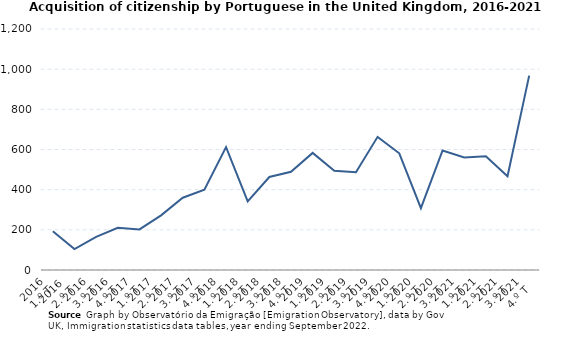
| Category | Series 0 |
|---|---|
| 2016
1.º T | 193 |
| 2016 
2.º T | 104 |
| 2016
3.º T | 165 |
| 2016
4.º T | 210 |
| 2017
1.º T | 202 |
| 2017
2.º T | 272 |
| 2017
3.º T | 360 |
| 2017
4.º T | 400 |
| 2018
1.º T | 612 |
| 2018
2.º T | 342 |
| 2018
3.º T | 463 |
| 2018
4.º T | 489 |
| 2019
1.º T | 583 |
| 2019
2.º T | 494 |
| 2019
3.º T | 487 |
| 2019
4.º T | 663 |
| 2020
1.º T | 581 |
| 2020
2.º T | 308 |
| 2020
3.º T | 595 |
| 2021
1.º T | 560 |
| 2021
2.º T | 566 |
| 2021
3.º T | 467 |
| 2021
4.º T | 968 |